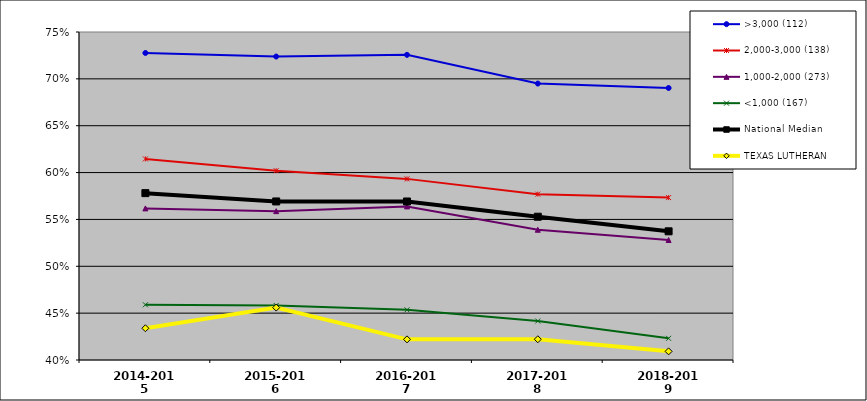
| Category | >3,000 (112) | 2,000-3,000 (138) | 1,000-2,000 (273) | <1,000 (167) | National Median | TEXAS LUTHERAN |
|---|---|---|---|---|---|---|
| 2014-2015 | 0.728 | 0.615 | 0.562 | 0.459 | 0.578 | 0.434 |
| 2015-2016 | 0.724 | 0.602 | 0.559 | 0.458 | 0.569 | 0.456 |
| 2016-2017 | 0.726 | 0.593 | 0.564 | 0.454 | 0.569 | 0.422 |
| 2017-2018 | 0.695 | 0.577 | 0.539 | 0.442 | 0.553 | 0.422 |
| 2018-2019 | 0.69 | 0.573 | 0.528 | 0.423 | 0.537 | 0.409 |